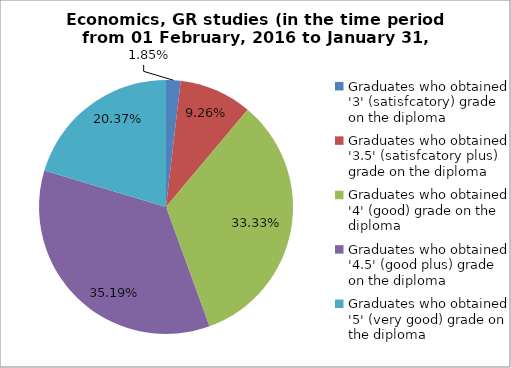
| Category | Series 0 |
|---|---|
| Graduates who obtained '3' (satisfcatory) grade on the diploma | 1.852 |
| Graduates who obtained '3.5' (satisfcatory plus) grade on the diploma | 9.259 |
| Graduates who obtained '4' (good) grade on the diploma | 33.333 |
| Graduates who obtained '4.5' (good plus) grade on the diploma | 35.185 |
| Graduates who obtained '5' (very good) grade on the diploma | 20.37 |